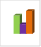
| Category | област Перник |
|---|---|
| летен сезон 2019  | 13452 |
| летен сезон 2021  | 7113 |
| летен сезон 2022 г.  | 16768 |